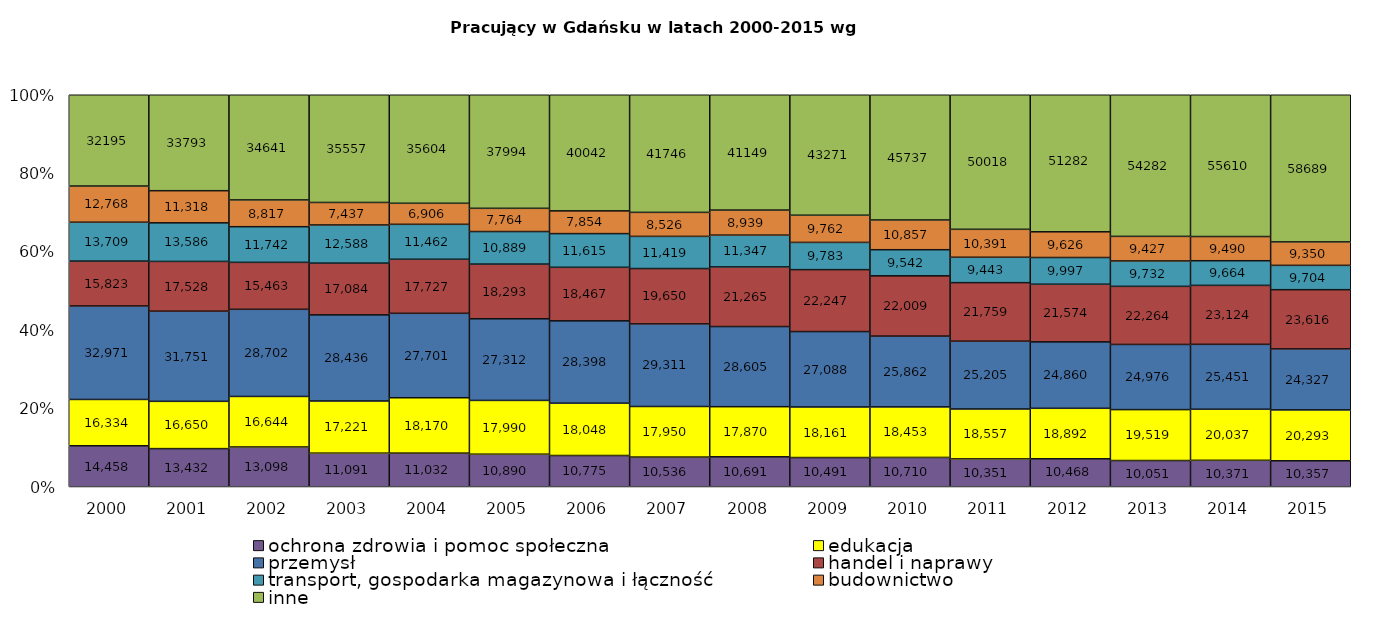
| Category | ochrona zdrowia i pomoc społeczna | edukacja | przemysł | handel i naprawy | transport, gospodarka magazynowa i łączność | budownictwo | inne |
|---|---|---|---|---|---|---|---|
| 2000.0 | 14458 | 16334 | 32971 | 15823 | 13709 | 12768 | 32195 |
| 2001.0 | 13432 | 16650 | 31751 | 17528 | 13586 | 11318 | 33793 |
| 2002.0 | 13098 | 16644 | 28702 | 15463 | 11742 | 8817 | 34641 |
| 2003.0 | 11091 | 17221 | 28436 | 17084 | 12588 | 7437 | 35557 |
| 2004.0 | 11032 | 18170 | 27701 | 17727 | 11462 | 6906 | 35604 |
| 2005.0 | 10890 | 17990 | 27312 | 18293 | 10889 | 7764 | 37994 |
| 2006.0 | 10775 | 18048 | 28398 | 18467 | 11615 | 7854 | 40042 |
| 2007.0 | 10536 | 17950 | 29311 | 19650 | 11419 | 8526 | 41746 |
| 2008.0 | 10691 | 17870 | 28605 | 21265 | 11347 | 8939 | 41149 |
| 2009.0 | 10491 | 18161 | 27088 | 22247 | 9783 | 9762 | 43271 |
| 2010.0 | 10710 | 18453 | 25862 | 22009 | 9542 | 10857 | 45737 |
| 2011.0 | 10351 | 18557 | 25205 | 21759 | 9443 | 10391 | 50018 |
| 2012.0 | 10468 | 18892 | 24860 | 21574 | 9997 | 9626 | 51282 |
| 2013.0 | 10051 | 19519 | 24976 | 22264 | 9732 | 9427 | 54282 |
| 2014.0 | 10371 | 20037 | 25451 | 23124 | 9664 | 9490 | 55610 |
| 2015.0 | 10357 | 20293 | 24327 | 23616 | 9704 | 9350 | 58689 |